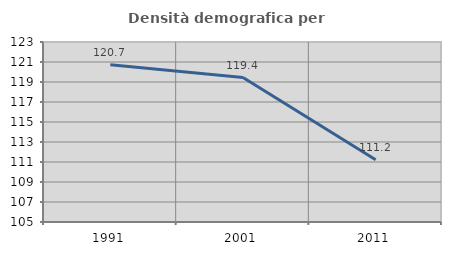
| Category | Densità demografica |
|---|---|
| 1991.0 | 120.736 |
| 2001.0 | 119.443 |
| 2011.0 | 111.23 |